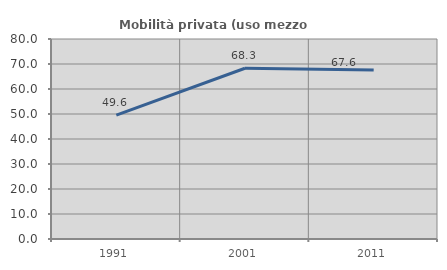
| Category | Mobilità privata (uso mezzo privato) |
|---|---|
| 1991.0 | 49.558 |
| 2001.0 | 68.293 |
| 2011.0 | 67.647 |